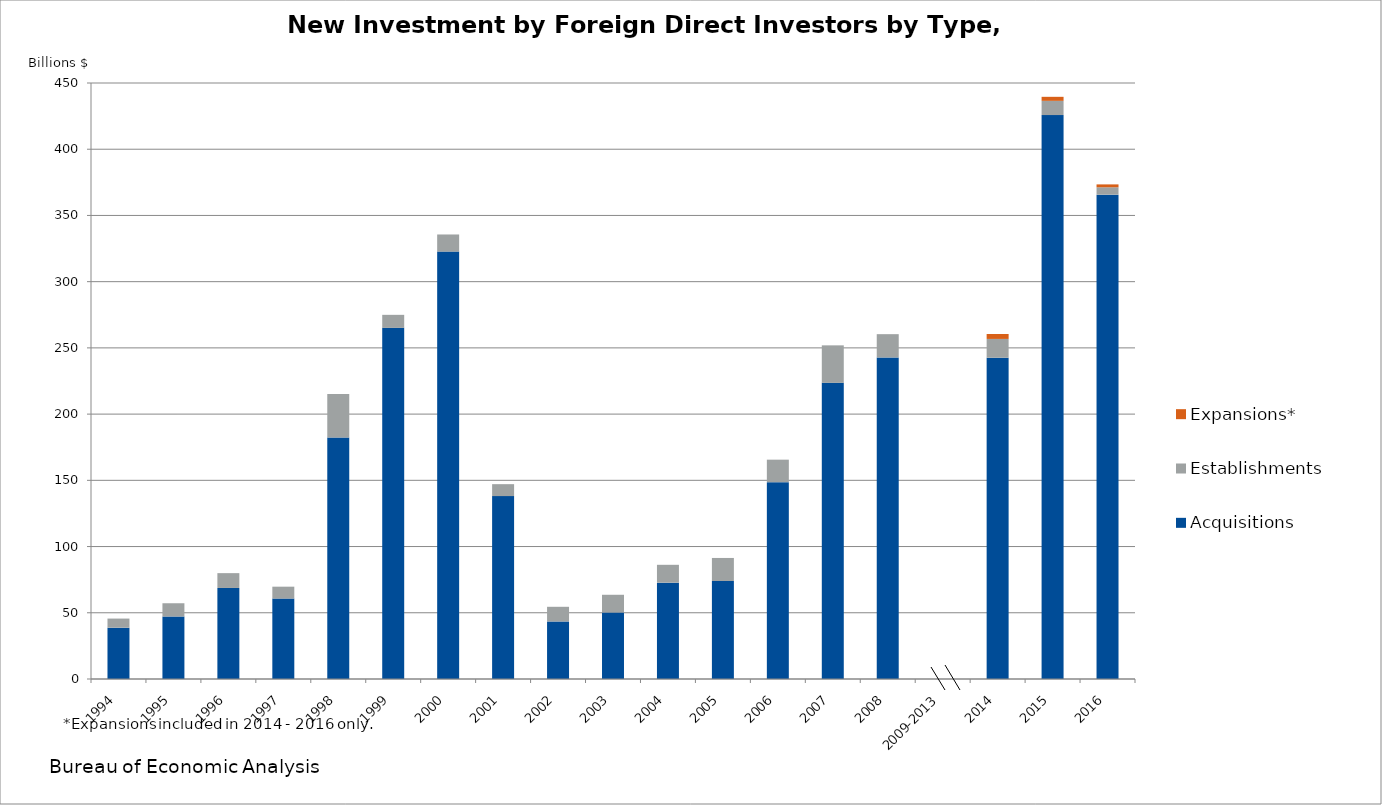
| Category | Acquisitions | Establishments | Expansions* |
|---|---|---|---|
| 1994 | 38.753 | 6.873 | 0 |
| 1995 | 47.179 | 10.016 | 0 |
| 1996 | 68.733 | 11.196 | 0 |
| 1997 | 60.733 | 8.974 | 0 |
| 1998 | 182.357 | 32.899 | 0 |
| 1999 | 265.127 | 9.829 | 0 |
| 2000 | 322.703 | 12.926 | 0 |
| 2001 | 138.091 | 9.017 | 0 |
| 2002 | 43.442 | 11.077 | 0 |
| 2003 | 50.212 | 13.379 | 0 |
| 2004 | 72.738 | 13.481 | 0 |
| 2005 | 73.997 | 17.393 | 0 |
| 2006 | 148.604 | 16.999 | 0 |
| 2007 | 223.616 | 28.301 | 0 |
| 2008 | 242.799 | 17.564 | 0 |
| 2009-2013 | 0 | 0 | 0 |
| 2014 | 242.58 | 14.183 | 3.724 |
| 2015 | 425.788 | 10.739 | 3.037 |
| 2016 | 365.7 | 5.565 | 2.175 |